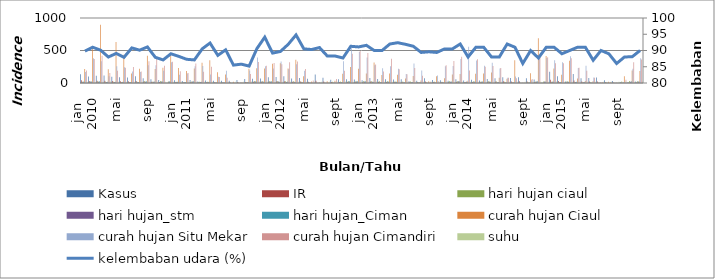
| Category | Kasus | IR | hari hujan ciaul | hari hujan_stm | hari hujan_Ciman | curah hujan Ciaul | curah hujan Situ Mekar | curah hujan Cimandiri | suhu  |
|---|---|---|---|---|---|---|---|---|---|
| 0 |  | 41.688 |  |  |  |  |  |  |  |
| 1 |  | 31.344 |  |  |  |  |  |  |  |
| 2 |  | 35.106 |  |  |  |  |  |  |  |
| 3 |  | 36.359 |  |  |  |  |  |  |  |
| 4 |  | 30.717 |  |  |  |  |  |  |  |
| 5 |  | 28.21 |  |  |  |  |  |  |  |
| 6 |  | 26.956 |  |  |  |  |  |  |  |
| 7 |  | 32.285 |  |  |  |  |  |  |  |
| 8 |  | 23.508 |  |  |  |  |  |  |  |
| 9 |  | 18.18 |  |  |  |  |  |  |  |
| 10 |  | 14.105 |  |  |  |  |  |  |  |
| 11 |  | 0 |  |  |  |  |  |  |  |
| 12 |  | 11.514 |  |  |  |  |  |  |  |
| 13 |  | 8.987 |  |  |  |  |  |  |  |
| 14 |  | 12.918 |  |  |  |  |  |  |  |
| 15 |  | 6.178 |  |  |  |  |  |  |  |
| 16 |  | 10.391 |  |  |  |  |  |  |  |
| 17 |  | 10.11 |  |  |  |  |  |  |  |
| 18 |  | 9.267 |  |  |  |  |  |  |  |
| 19 |  | 9.829 |  |  |  |  |  |  |  |
| 20 |  | 13.48 |  |  |  |  |  |  |  |
| 21 |  | 17.131 |  |  |  |  |  |  |  |
| 22 |  | 18.816 |  |  |  |  |  |  |  |
| 23 |  | 19.658 |  |  |  |  |  |  |  |
| 24 |  | 24.41 |  |  |  |  |  |  |  |
| 25 |  | 25.233 |  |  |  |  |  |  |  |
| 26 |  | 28.25 |  |  |  |  |  |  |  |
| 27 |  | 18.65 |  |  |  |  |  |  |  |
| 28 |  | 21.393 |  |  |  |  |  |  |  |
| 29 |  | 18.102 |  |  |  |  |  |  |  |
| 30 |  | 35.655 |  |  |  |  |  |  |  |
| 31 |  | 22.216 |  |  |  |  |  |  |  |
| 32 |  | 13.988 |  |  |  |  |  |  |  |
| 33 |  | 15.359 |  |  |  |  |  |  |  |
| 34 |  | 15.359 |  |  |  |  |  |  |  |
| 35 |  | 14.262 |  |  |  |  |  |  |  |
| 36 |  | 11.985 |  |  |  |  |  |  |  |
| 37 |  | 22.509 |  |  |  |  |  |  |  |
| 38 |  | 18.417 |  |  |  |  |  |  |  |
| 39 |  | 16.37 |  |  |  |  |  |  |  |
| 40 |  | 15.493 |  |  |  |  |  |  |  |
| 41 |  | 16.663 |  |  |  |  |  |  |  |
| 42 |  | 7.601 |  |  |  |  |  |  |  |
| 43 |  | 10.524 |  |  |  |  |  |  |  |
| 44 |  | 21.632 |  |  |  |  |  |  |  |
| 45 |  | 13.739 |  |  |  |  |  |  |  |
| 46 |  | 12.862 |  |  |  |  |  |  |  |
| 47 |  | 9.939 |  |  |  |  |  |  |  |
| 48 |  | 18.413 |  |  |  |  |  |  |  |
| 49 |  | 12.381 |  |  |  |  |  |  |  |
| 50 |  | 16.19 |  |  |  |  |  |  |  |
| 51 |  | 12.381 |  |  |  |  |  |  |  |
| 52 |  | 19.682 |  |  |  |  |  |  |  |
| 53 |  | 23.175 |  |  |  |  |  |  |  |
| 54 |  | 27.619 |  |  |  |  |  |  |  |
| 55 |  | 24.444 |  |  |  |  |  |  |  |
| 56 |  | 28.254 |  |  |  |  |  |  |  |
| 57 |  | 22.857 |  |  |  |  |  |  |  |
| 58 |  | 16.825 |  |  |  |  |  |  |  |
| 59 |  | 1.587 |  |  |  |  |  |  |  |
| 60 |  | 50.432 |  |  |  |  |  |  |  |
| 61 |  | 29.683 |  |  |  |  |  |  |  |
| 62 |  | 6.34 |  |  |  |  |  |  |  |
| 63 |  | 40.058 |  |  |  |  |  |  |  |
| 64 |  | 21.614 |  |  |  |  |  |  |  |
| 65 |  | 21.902 |  |  |  |  |  |  |  |
| 66 |  | 23.919 |  |  |  |  |  |  |  |
| 67 |  | 11.816 |  |  |  |  |  |  |  |
| 68 |  | 8.357 |  |  |  |  |  |  |  |
| 69 |  | 4.899 |  |  |  |  |  |  |  |
| 70 |  | 3.458 |  |  |  |  |  |  |  |
| 71 |  | 7.205 |  |  |  |  |  |  |  |